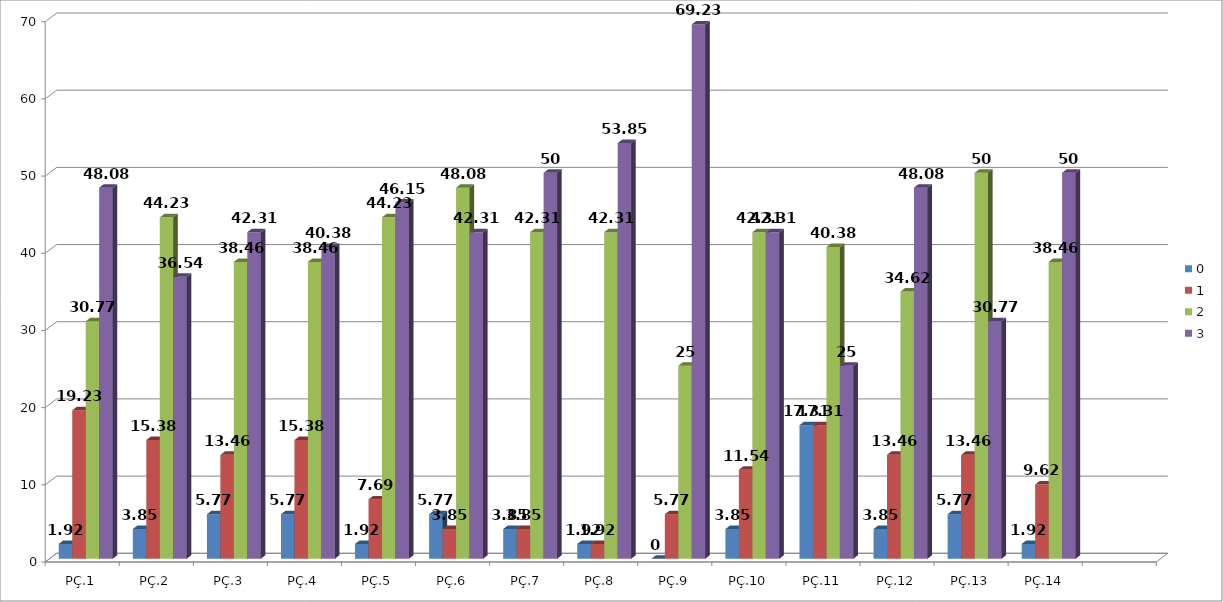
| Category | 0 | 1 | 2 | 3 |
|---|---|---|---|---|
| PÇ.1 | 1.92 | 19.23 | 30.77 | 48.08 |
| PÇ.2 | 3.85 | 15.38 | 44.23 | 36.54 |
| PÇ.3 | 5.77 | 13.46 | 38.46 | 42.31 |
| PÇ.4 | 5.77 | 15.38 | 38.46 | 40.38 |
| PÇ.5 | 1.92 | 7.69 | 44.23 | 46.15 |
| PÇ.6 | 5.77 | 3.85 | 48.08 | 42.31 |
| PÇ.7 | 3.85 | 3.85 | 42.31 | 50 |
| PÇ.8 | 1.92 | 1.92 | 42.31 | 53.85 |
| PÇ.9 | 0 | 5.77 | 25 | 69.23 |
| PÇ.10 | 3.85 | 11.54 | 42.31 | 42.31 |
| PÇ.11 | 17.31 | 17.31 | 40.38 | 25 |
| PÇ.12 | 3.85 | 13.46 | 34.62 | 48.08 |
| PÇ.13 | 5.77 | 13.46 | 50 | 30.77 |
| PÇ.14 | 1.92 | 9.62 | 38.46 | 50 |